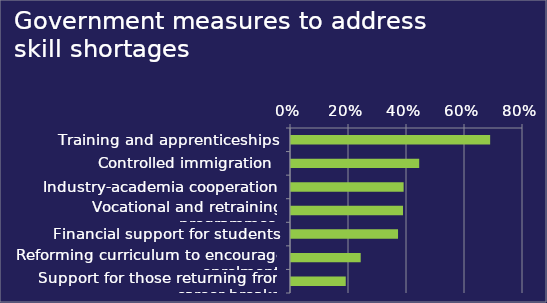
| Category | % of respondents |
|---|---|
| Training and apprenticeships | 0.687 |
| Controlled immigration  | 0.442 |
| Industry-academia cooperation | 0.388 |
| Vocational and retraining programmes  | 0.386 |
| Financial support for students | 0.369 |
| Reforming curriculum to encourage enrolment | 0.24 |
| Support for those returning from career breaks | 0.189 |